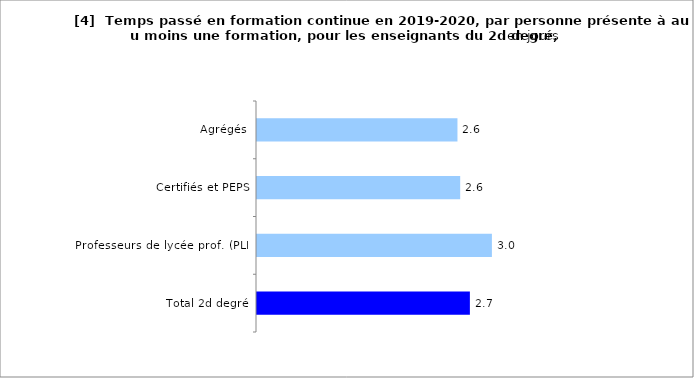
| Category | Series 0 |
|---|---|
| Total 2d degré | 2.715 |
| Professeurs de lycée prof. (PLP) | 2.996 |
| Certifiés et PEPS | 2.592 |
| Agrégés | 2.557 |